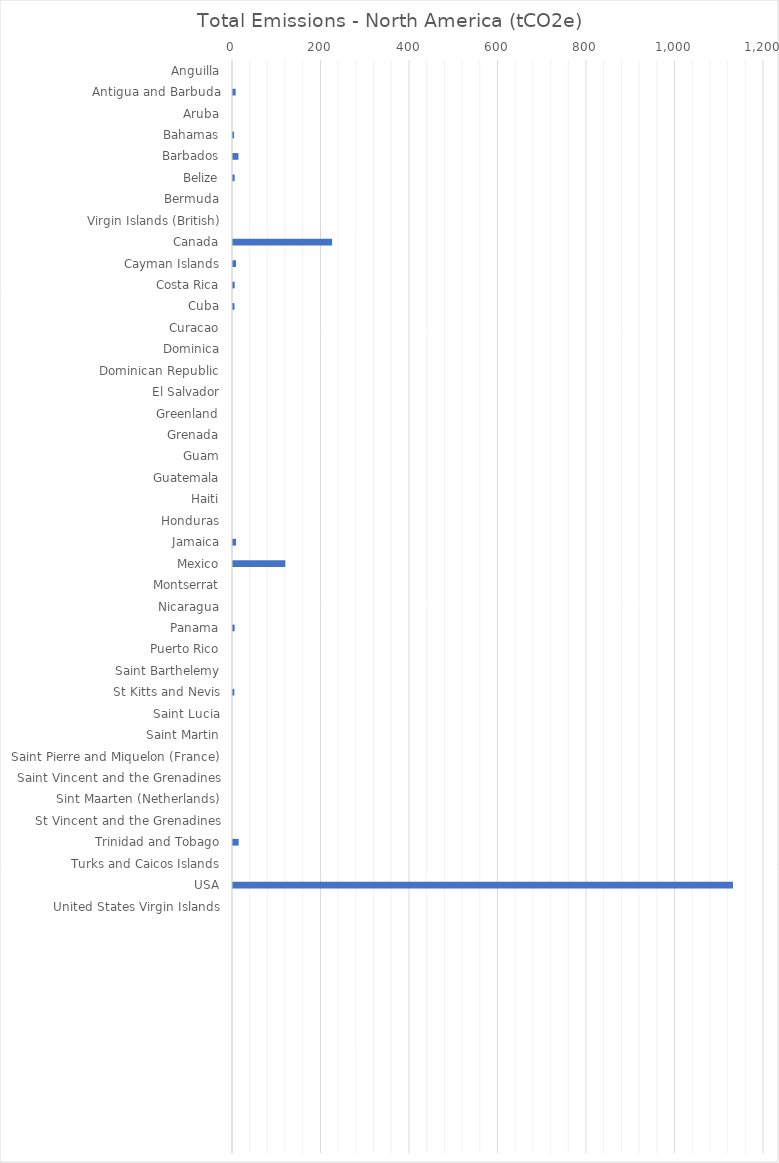
| Category | Total Emissions - North America (tCO2e) |
|---|---|
| Anguilla | 0 |
| Antigua and Barbuda | 5.978 |
| Aruba | 0 |
| Bahamas | 2.398 |
| Barbados | 12.273 |
| Belize | 3.711 |
| Bermuda | 0 |
| Virgin Islands (British) | 0 |
| Canada | 223.997 |
| Cayman Islands | 6.908 |
| Costa Rica | 3.848 |
| Cuba | 3.354 |
| Curacao | 0 |
| Dominica | 0 |
| Dominican Republic | 0 |
| El Salvador | 0 |
| Greenland | 0 |
| Grenada | 0 |
| Guam | 0 |
| Guatemala | 0 |
| Haiti | 0 |
| Honduras | 0 |
| Jamaica | 6.742 |
| Mexico | 118.188 |
| Montserrat | 0 |
| Nicaragua | 0 |
| Panama | 3.759 |
| Puerto Rico | 0 |
| Saint Barthelemy | 0 |
| St Kitts and Nevis | 3.007 |
| Saint Lucia | 0 |
| Saint Martin | 0 |
| Saint Pierre and Miquelon (France) | 0 |
| Saint Vincent and the Grenadines | 0 |
| Sint Maarten (Netherlands) | 0 |
| St Vincent and the Grenadines | 0 |
| Trinidad and Tobago | 12.802 |
| Turks and Caicos Islands | 0 |
| USA | 1129.944 |
| United States Virgin Islands | 0 |